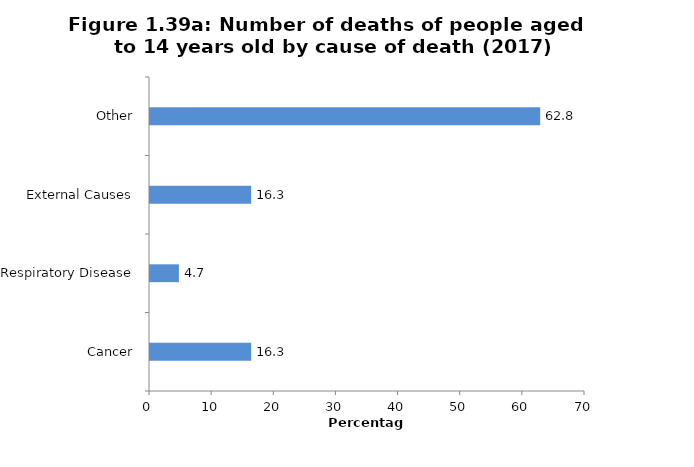
| Category | Percentage |
|---|---|
| Cancer | 16.279 |
| Respiratory Disease | 4.651 |
| External Causes | 16.279 |
| Other | 62.791 |